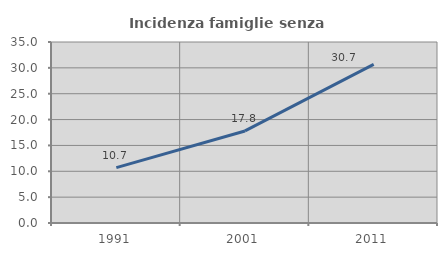
| Category | Incidenza famiglie senza nuclei |
|---|---|
| 1991.0 | 10.697 |
| 2001.0 | 17.8 |
| 2011.0 | 30.671 |